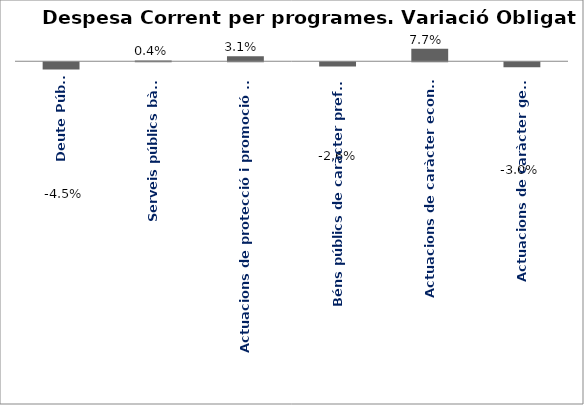
| Category | Series 0 |
|---|---|
| Deute Públic | -0.045 |
| Serveis públics bàsics | 0.004 |
| Actuacions de protecció i promoció social | 0.031 |
| Béns públics de caràcter preferent | -0.026 |
| Actuacions de caràcter econòmic | 0.077 |
| Actuacions de caràcter general | -0.03 |